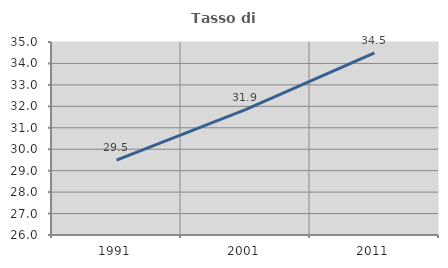
| Category | Tasso di occupazione   |
|---|---|
| 1991.0 | 29.491 |
| 2001.0 | 31.851 |
| 2011.0 | 34.498 |